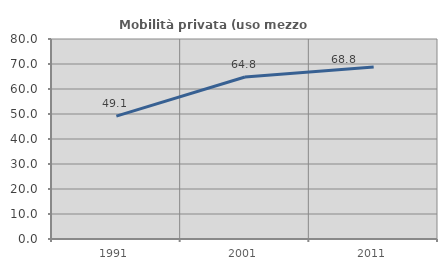
| Category | Mobilità privata (uso mezzo privato) |
|---|---|
| 1991.0 | 49.126 |
| 2001.0 | 64.815 |
| 2011.0 | 68.803 |